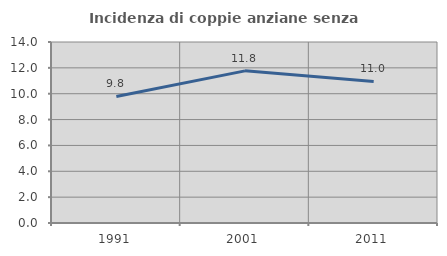
| Category | Incidenza di coppie anziane senza figli  |
|---|---|
| 1991.0 | 9.786 |
| 2001.0 | 11.767 |
| 2011.0 | 10.951 |